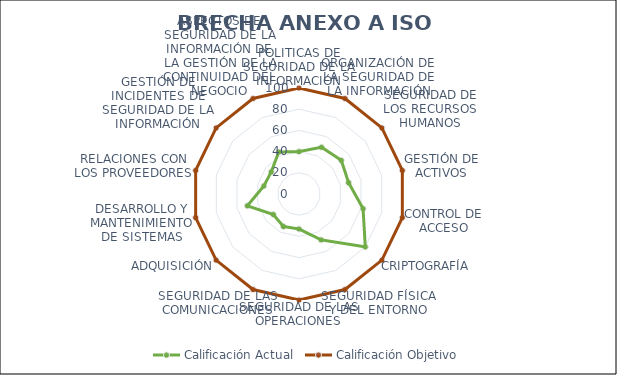
| Category | Calificación Actual | Calificación Objetivo |
|---|---|---|
| 0 | 40 | 100 |
| 1 | 49 | 100 |
| 2 | 51 | 100 |
| 3 | 48 | 100 |
| 4 | 62 | 100 |
| 5 | 80 | 100 |
| 6 | 48 | 100 |
| 7 | 33 | 100 |
| 8 | 34 | 100 |
| 9 | 31 | 100 |
| 10 | 50 | 100 |
| 11 | 34 | 100 |
| 12 | 33.5 | 100 |
| 13 | 44 | 100 |